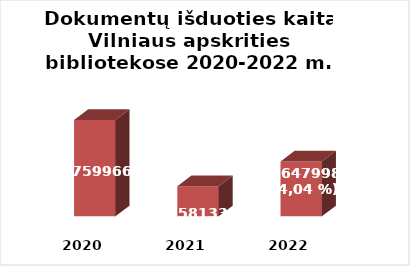
| Category | Series 0 |
|---|---|
| 2020.0 | 1759966 |
| 2021.0 | 1581339 |
| 2022.0 | 1647998 |